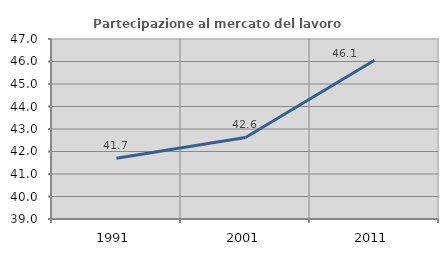
| Category | Partecipazione al mercato del lavoro  femminile |
|---|---|
| 1991.0 | 41.701 |
| 2001.0 | 42.625 |
| 2011.0 | 46.057 |